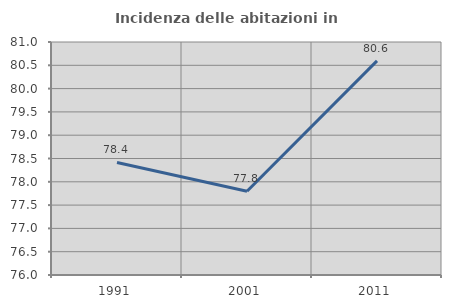
| Category | Incidenza delle abitazioni in proprietà  |
|---|---|
| 1991.0 | 78.415 |
| 2001.0 | 77.796 |
| 2011.0 | 80.596 |